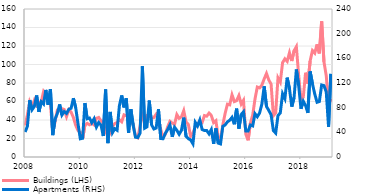
| Category | Buildings (LHS) |
|---|---|
| 2008-01-01 | 34.062 |
| 2008-02-01 | 45.864 |
| 2008-03-01 | 59.806 |
| 2008-04-01 | 54.182 |
| 2008-05-01 | 61.311 |
| 2008-06-01 | 55.766 |
| 2008-07-01 | 59.093 |
| 2008-08-01 | 59.806 |
| 2008-09-01 | 70.5 |
| 2008-10-01 | 66.064 |
| 2008-11-01 | 62.499 |
| 2008-12-01 | 57.033 |
| 2009-01-01 | 26.616 |
| 2009-02-01 | 38.498 |
| 2009-03-01 | 50.617 |
| 2009-04-01 | 50.459 |
| 2009-05-01 | 52.201 |
| 2009-06-01 | 51.409 |
| 2009-07-01 | 43.646 |
| 2009-08-01 | 51.172 |
| 2009-09-01 | 48.478 |
| 2009-10-01 | 42.617 |
| 2009-11-01 | 34.22 |
| 2009-12-01 | 28.596 |
| 2010-01-01 | 26.695 |
| 2010-02-01 | 19.645 |
| 2010-03-01 | 34.22 |
| 2010-04-01 | 36.359 |
| 2010-05-01 | 34.854 |
| 2010-06-01 | 36.438 |
| 2010-07-01 | 34.695 |
| 2010-08-01 | 41.904 |
| 2010-09-01 | 42.775 |
| 2010-10-01 | 39.052 |
| 2010-11-01 | 36.913 |
| 2010-12-01 | 28.121 |
| 2011-01-01 | 21.863 |
| 2011-02-01 | 25.507 |
| 2011-03-01 | 33.032 |
| 2011-04-01 | 36.2 |
| 2011-05-01 | 37.309 |
| 2011-06-01 | 40.24 |
| 2011-07-01 | 38.102 |
| 2011-08-01 | 45.548 |
| 2011-09-01 | 44.597 |
| 2011-10-01 | 45.706 |
| 2011-11-01 | 38.814 |
| 2011-12-01 | 35.725 |
| 2012-01-01 | 21.942 |
| 2012-02-01 | 20.754 |
| 2012-03-01 | 33.27 |
| 2012-04-01 | 45.627 |
| 2012-05-01 | 38.894 |
| 2012-06-01 | 44.755 |
| 2012-07-01 | 44.597 |
| 2012-08-01 | 41.825 |
| 2012-09-01 | 42.696 |
| 2012-10-01 | 46.181 |
| 2012-11-01 | 40.478 |
| 2012-12-01 | 29.626 |
| 2013-01-01 | 21.546 |
| 2013-02-01 | 24.715 |
| 2013-03-01 | 32.636 |
| 2013-04-01 | 38.577 |
| 2013-05-01 | 36.676 |
| 2013-06-01 | 35.25 |
| 2013-07-01 | 45.864 |
| 2013-08-01 | 41.825 |
| 2013-09-01 | 43.409 |
| 2013-10-01 | 50.063 |
| 2013-11-01 | 37.943 |
| 2013-12-01 | 35.171 |
| 2014-01-01 | 22.259 |
| 2014-02-01 | 25.744 |
| 2014-03-01 | 32.715 |
| 2014-04-01 | 35.567 |
| 2014-05-01 | 38.418 |
| 2014-06-01 | 37.23 |
| 2014-07-01 | 44.835 |
| 2014-08-01 | 44.122 |
| 2014-09-01 | 47.449 |
| 2014-10-01 | 44.914 |
| 2014-11-01 | 37.151 |
| 2014-12-01 | 39.211 |
| 2015-01-01 | 21.071 |
| 2015-02-01 | 18.219 |
| 2015-03-01 | 34.616 |
| 2015-04-01 | 47.132 |
| 2015-05-01 | 57.113 |
| 2015-06-01 | 56.4 |
| 2015-07-01 | 67.252 |
| 2015-08-01 | 59.885 |
| 2015-09-01 | 60.915 |
| 2015-10-01 | 66.46 |
| 2015-11-01 | 57.271 |
| 2015-12-01 | 61.311 |
| 2016-01-01 | 24.715 |
| 2016-02-01 | 18.061 |
| 2016-03-01 | 36.676 |
| 2016-04-01 | 45.31 |
| 2016-05-01 | 62.737 |
| 2016-06-01 | 75.649 |
| 2016-07-01 | 74.698 |
| 2016-08-01 | 77.708 |
| 2016-09-01 | 84.441 |
| 2016-10-01 | 90.303 |
| 2016-11-01 | 83.253 |
| 2016-12-01 | 78.817 |
| 2017-01-01 | 44.597 |
| 2017-02-01 | 47.766 |
| 2017-03-01 | 85.55 |
| 2017-04-01 | 80.956 |
| 2017-05-01 | 102.027 |
| 2017-06-01 | 106.146 |
| 2017-07-01 | 103.373 |
| 2017-08-01 | 112.72 |
| 2017-09-01 | 103.769 |
| 2017-10-01 | 114.859 |
| 2017-11-01 | 119.295 |
| 2017-12-01 | 88.085 |
| 2018-01-01 | 62.341 |
| 2018-02-01 | 64.638 |
| 2018-03-01 | 91.095 |
| 2018-04-01 | 79.372 |
| 2018-05-01 | 104.007 |
| 2018-06-01 | 115.097 |
| 2018-07-01 | 112.324 |
| 2018-08-01 | 121.751 |
| 2018-09-30 | 112.007 |
| 2018-10-31 | 146.544 |
| 2018-11-30 | 102.898 |
| 2018-12-31 | 87.927 |
| 2019-01-31 | 56.321 |
| 2019-02-28 | 62.895 |